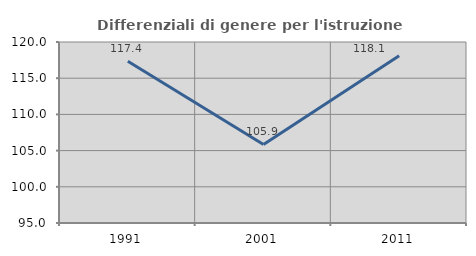
| Category | Differenziali di genere per l'istruzione superiore |
|---|---|
| 1991.0 | 117.353 |
| 2001.0 | 105.856 |
| 2011.0 | 118.092 |